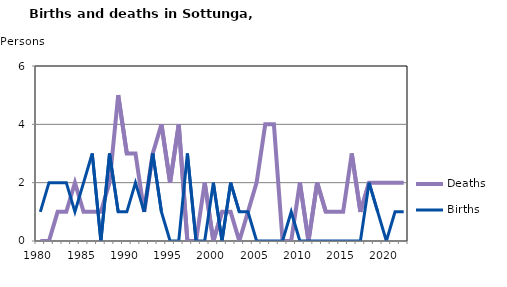
| Category | Deaths | Births |
|---|---|---|
| 1980.0 | 0 | 1 |
| 1981.0 | 0 | 2 |
| 1982.0 | 1 | 2 |
| 1983.0 | 1 | 2 |
| 1984.0 | 2 | 1 |
| 1985.0 | 1 | 2 |
| 1986.0 | 1 | 3 |
| 1987.0 | 1 | 0 |
| 1988.0 | 2 | 3 |
| 1989.0 | 5 | 1 |
| 1990.0 | 3 | 1 |
| 1991.0 | 3 | 2 |
| 1992.0 | 1 | 1 |
| 1993.0 | 3 | 3 |
| 1994.0 | 4 | 1 |
| 1995.0 | 2 | 0 |
| 1996.0 | 4 | 0 |
| 1997.0 | 0 | 3 |
| 1998.0 | 0 | 0 |
| 1999.0 | 2 | 0 |
| 2000.0 | 0 | 2 |
| 2001.0 | 1 | 0 |
| 2002.0 | 1 | 2 |
| 2003.0 | 0 | 1 |
| 2004.0 | 1 | 1 |
| 2005.0 | 2 | 0 |
| 2006.0 | 4 | 0 |
| 2007.0 | 4 | 0 |
| 2008.0 | 0 | 0 |
| 2009.0 | 0 | 1 |
| 2010.0 | 2 | 0 |
| 2011.0 | 0 | 0 |
| 2012.0 | 2 | 0 |
| 2013.0 | 1 | 0 |
| 2014.0 | 1 | 0 |
| 2015.0 | 1 | 0 |
| 2016.0 | 3 | 0 |
| 2017.0 | 1 | 0 |
| 2018.0 | 2 | 2 |
| 2019.0 | 2 | 1 |
| 2020.0 | 2 | 0 |
| 2021.0 | 2 | 1 |
| 2022.0 | 2 | 1 |